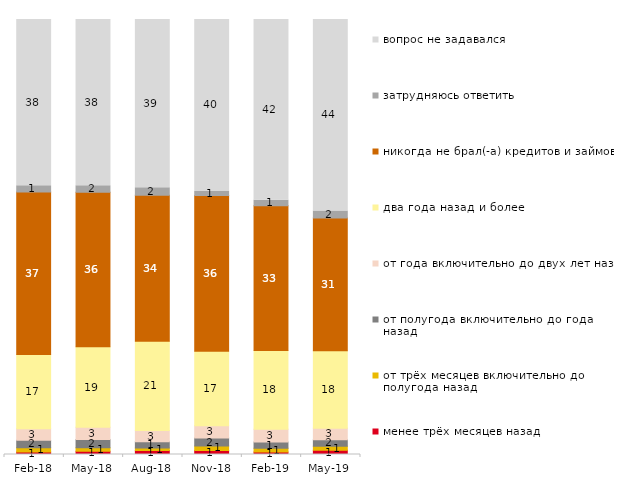
| Category | менее трёх месяцев назад | от трёх месяцев включительно до полугода назад | от полугода включительно до года назад | от года включительно до двух лет назад | два года назад и более | никогда не брал(-а) кредитов и займов | затрудняюсь ответить | вопрос не задавался |
|---|---|---|---|---|---|---|---|---|
| 2018-02-01 | 0.55 | 1 | 1.75 | 2.6 | 17.1 | 37.35 | 1.45 | 38.2 |
| 2018-05-01 | 0.75 | 0.8 | 1.9 | 2.8 | 18.5 | 35.55 | 1.5 | 38.2 |
| 2018-08-01 | 0.9 | 0.6 | 1.45 | 2.55 | 20.55 | 33.55 | 1.7 | 38.7 |
| 2018-11-01 | 0.948 | 0.998 | 1.846 | 2.844 | 17.116 | 35.778 | 0.948 | 39.521 |
| 2019-02-01 | 0.6 | 0.85 | 1.45 | 2.9 | 18.1 | 33.3 | 1.25 | 41.55 |
| 2019-05-01 | 0.991 | 0.892 | 1.535 | 2.625 | 17.831 | 30.51 | 1.585 | 44.032 |